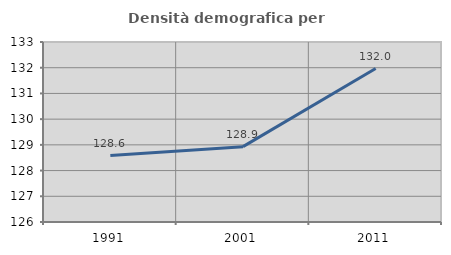
| Category | Densità demografica |
|---|---|
| 1991.0 | 128.582 |
| 2001.0 | 128.93 |
| 2011.0 | 131.968 |